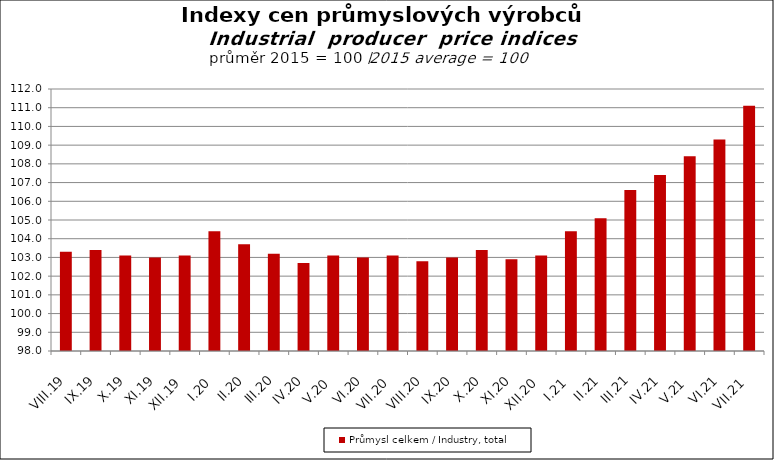
| Category | Průmysl celkem / Industry, total |
|---|---|
| VIII.19 | 103.3 |
| IX.19 | 103.4 |
| X.19 | 103.1 |
| XI.19 | 103 |
| XII.19 | 103.1 |
| I.20 | 104.4 |
| II.20 | 103.7 |
| III.20 | 103.2 |
| IV.20 | 102.7 |
| V.20 | 103.1 |
| VI.20 | 103 |
| VII.20 | 103.1 |
| VIII.20 | 102.8 |
| IX.20 | 103 |
| X.20 | 103.4 |
| XI.20 | 102.9 |
| XII.20 | 103.1 |
| I.21 | 104.4 |
| II.21 | 105.1 |
| III.21 | 106.6 |
| IV.21 | 107.4 |
| V.21 | 108.4 |
| VI.21 | 109.3 |
| VII.21 | 111.1 |